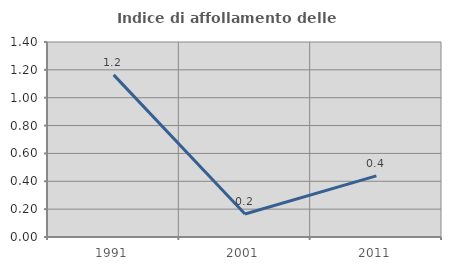
| Category | Indice di affollamento delle abitazioni  |
|---|---|
| 1991.0 | 1.164 |
| 2001.0 | 0.166 |
| 2011.0 | 0.439 |